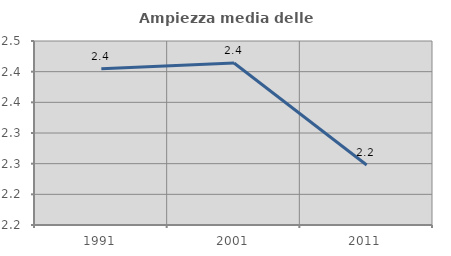
| Category | Ampiezza media delle famiglie |
|---|---|
| 1991.0 | 2.405 |
| 2001.0 | 2.414 |
| 2011.0 | 2.248 |